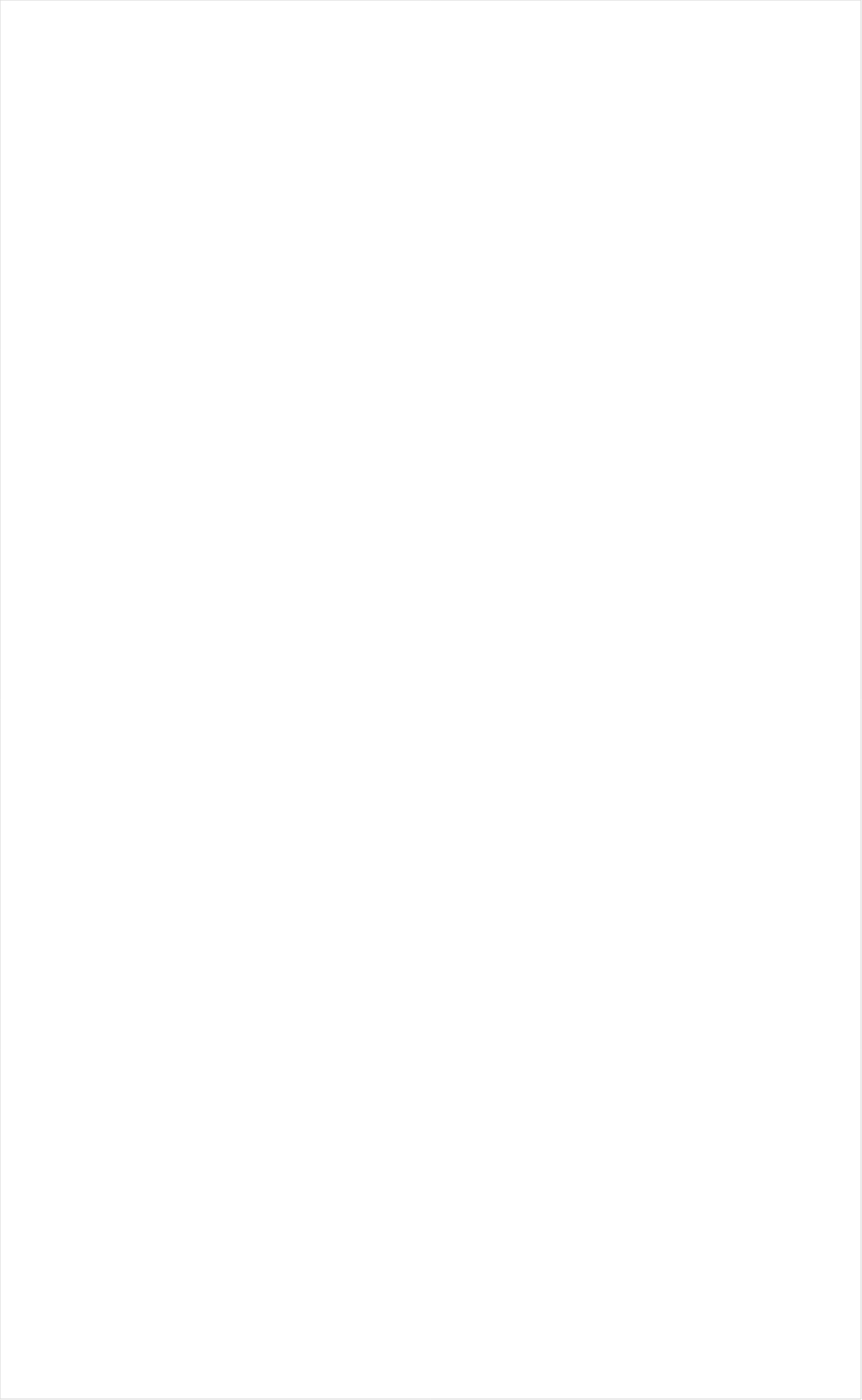
| Category | Total |
|---|---|
| RFD TV | -0.235 |
| PBS | -0.201 |
| MSNBC | -0.172 |
| Hallmark Movies & Mysteries | -0.171 |
| NHL | -0.165 |
| Fox Business | -0.159 |
| PAC-12 Network | -0.147 |
| Smithsonian | -0.145 |
| INSP | -0.138 |
| Big Ten Network | -0.138 |
| Fox News | -0.127 |
| CBS | -0.114 |
| Hallmark | -0.114 |
| SundanceTV | -0.113 |
| CBS Sports | -0.109 |
| ESPNU | -0.104 |
| The Sportsman Channel | -0.104 |
| DIY | -0.101 |
| National Geographic Wild | -0.099 |
| Weather Channel | -0.097 |
| American Heroes Channel | -0.096 |
| History Channel | -0.094 |
| Ovation | -0.087 |
| Fox Sports 1 | -0.087 |
| Bloomberg HD | -0.087 |
| Science Channel | -0.087 |
| FXDEP | -0.086 |
| Headline News | -0.082 |
| Reelz Channel | -0.08 |
| NBC | -0.08 |
| National Geographic | -0.079 |
| Tennis Channel | -0.076 |
| ABC | -0.074 |
| Olympic Channel | -0.074 |
| Game Show | -0.073 |
| Logo | -0.065 |
| CNN | -0.065 |
| Great American Country | -0.064 |
| POP | -0.064 |
| Outdoor Channel | -0.063 |
| BBC America | -0.062 |
| CW | -0.059 |
| HGTV | -0.057 |
| TV LAND | -0.052 |
| Golf | -0.051 |
| Destination America | -0.05 |
| FOX | -0.046 |
| ION | -0.046 |
| OXYGEN | -0.046 |
| WGN America | -0.045 |
| Cooking Channel | -0.044 |
| Investigation Discovery | -0.042 |
| Motor Trend Network | -0.041 |
| FOX Sports 2 | -0.039 |
| Animal Planet | -0.032 |
| FYI | -0.032 |
| Travel | -0.031 |
| Oprah Winfrey Network | -0.03 |
| Discovery Channel | -0.026 |
| AMC | -0.021 |
| Discovery Life Channel | -0.018 |
| UP TV | -0.013 |
| TNT | -0.012 |
| MyNetworkTV | -0.01 |
| CMTV | -0.009 |
| MLB Network | -0.008 |
| WE TV | -0.007 |
| ESPNEWS | -0.003 |
| Food Network | -0.003 |
| NFL Network | -0.001 |
| Lifetime | 0.001 |
| BRAVO | 0.002 |
| Discovery Family Channel | 0.004 |
| A&E | 0.006 |
| USA Network | 0.009 |
| FX Movie Channel | 0.015 |
| Independent Film (IFC) | 0.018 |
| E! | 0.021 |
| BET Her | 0.022 |
| NBC Sports | 0.027 |
| Paramount Network | 0.031 |
| TLC | 0.031 |
| CNBC | 0.031 |
| SYFY | 0.032 |
| TBS | 0.037 |
| Lifetime Movies | 0.043 |
| TV ONE | 0.048 |
| ESPN | 0.048 |
| ESPN2 | 0.053 |
| FX | 0.054 |
| Teen Nick | 0.061 |
| NBA TV | 0.062 |
| FXX | 0.07 |
| ESPN Deportes | 0.07 |
| Viceland | 0.087 |
| Freeform | 0.094 |
| BET | 0.097 |
| Disney Channel | 0.118 |
| truTV | 0.118 |
| Comedy Central | 0.122 |
| Disney XD | 0.13 |
| Nick@Nite | 0.149 |
| Cartoon Network | 0.16 |
| Nick Toons | 0.162 |
| Nick | 0.168 |
| MTV | 0.179 |
| VH1 | 0.183 |
| Galavision | 0.203 |
| Adult Swim | 0.219 |
| UniMas | 0.236 |
| Univision | 0.237 |
| NBC Universo | 0.239 |
| Telemundo | 0.245 |
| Universal Kids | 0.254 |
| MTV2 | 0.263 |
| Nick Jr. | 0.327 |
| Disney Junior US | 0.328 |
| TUDN | 0.328 |